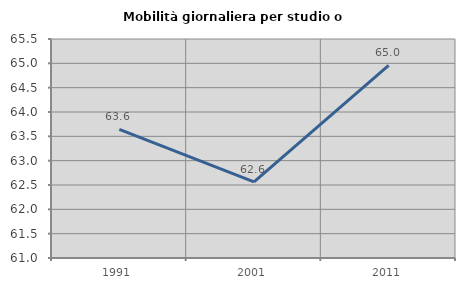
| Category | Mobilità giornaliera per studio o lavoro |
|---|---|
| 1991.0 | 63.644 |
| 2001.0 | 62.564 |
| 2011.0 | 64.959 |